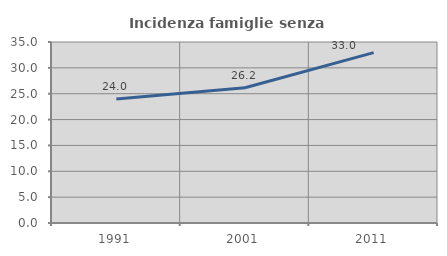
| Category | Incidenza famiglie senza nuclei |
|---|---|
| 1991.0 | 23.988 |
| 2001.0 | 26.165 |
| 2011.0 | 32.955 |